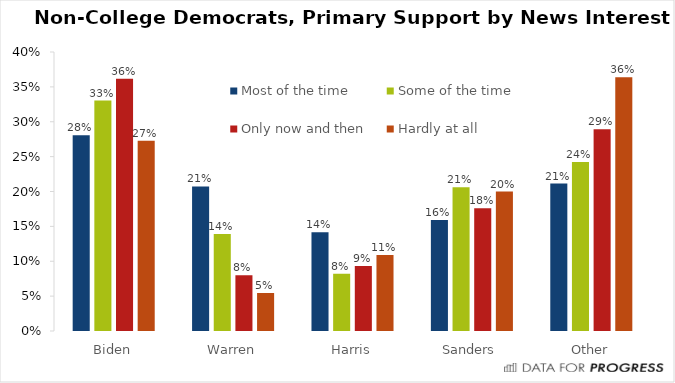
| Category | Most of the time | Some of the time | Only now and then | Hardly at all |
|---|---|---|---|---|
| Biden | 0.281 | 0.33 | 0.362 | 0.273 |
| Warren | 0.207 | 0.139 | 0.08 | 0.054 |
| Harris | 0.142 | 0.082 | 0.093 | 0.109 |
| Sanders | 0.159 | 0.206 | 0.176 | 0.2 |
| Other | 0.211 | 0.242 | 0.289 | 0.364 |